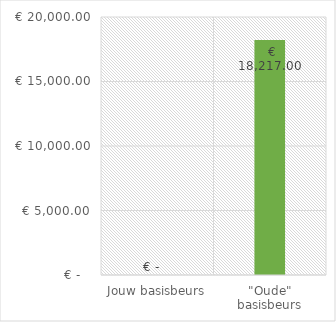
| Category | Series 0 |
|---|---|
| Jouw basisbeurs | 0 |
| "Oude" basisbeurs | 18217 |